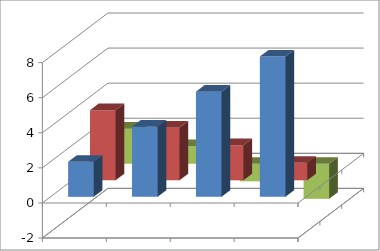
| Category | Series 1 | Series 2 | Series 3 |
|---|---|---|---|
| Point 1 | 2 | 4 | 2 |
| Point 2 | 4 | 3 | 1 |
| Point 3 | 6 | 2 | -1 |
| Point 4 | 8 | 1 | -2 |